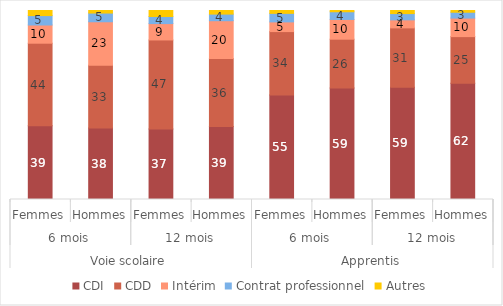
| Category | CDI | CDD | Intérim | Contrat professionnel | Autres |
|---|---|---|---|---|---|
| 0 | 38.97 | 43.73 | 9.63 | 4.98 | 2.69 |
| 1 | 37.8 | 33.25 | 22.99 | 4.61 | 1.35 |
| 2 | 37.35 | 47.06 | 8.67 | 3.74 | 3.18 |
| 3 | 38.58 | 36 | 20.02 | 3.5 | 1.9 |
| 4 | 55.35 | 33.5 | 5.13 | 4.52 | 1.51 |
| 5 | 58.94 | 25.87 | 10.45 | 4.06 | 0.67 |
| 6 | 59.33 | 31.47 | 4.25 | 3.31 | 1.64 |
| 7 | 61.55 | 24.62 | 9.81 | 3.09 | 0.92 |